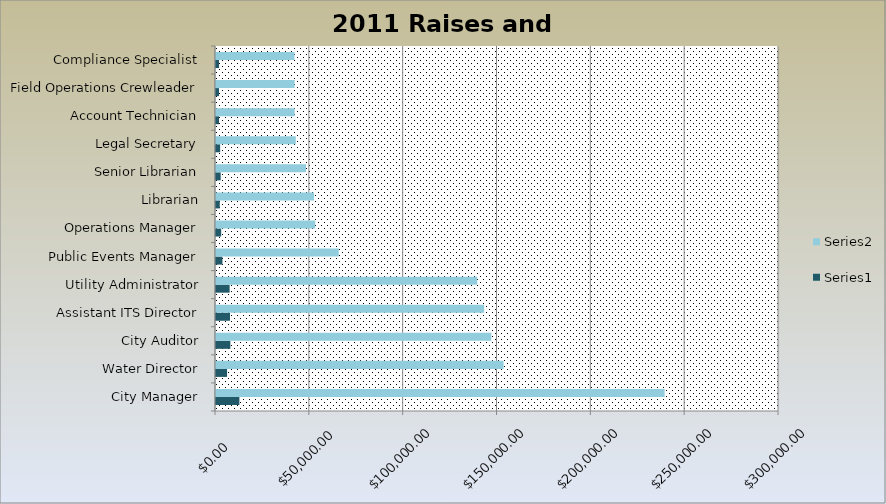
| Category | Series 0 | Series 1 |
|---|---|---|
| City Manager | 12462.725 | 239057.725 |
| Water Director | 5893.88 | 153240.88 |
| City Auditor | 7647.64 | 146695.64 |
| Assistant ITS Director | 7448.595 | 142877.595 |
| Utility Administrator | 7256.37 | 139190.37 |
| Public Events Manager | 3410.44 | 65418.44 |
| Operations Manager | 2755.885 | 52862.885 |
| Librarian | 2009.28 | 52241.28 |
| Senior Librarian | 2499.64 | 47947.64 |
| Legal Secretary | 2215.95 | 42505.95 |
| Account Technician | 1611.6 | 41901.6 |
| Field Operations Crewleader | 1610.76 | 41879.76 |
| Compliance Specialist | 1606.6 | 41771.6 |